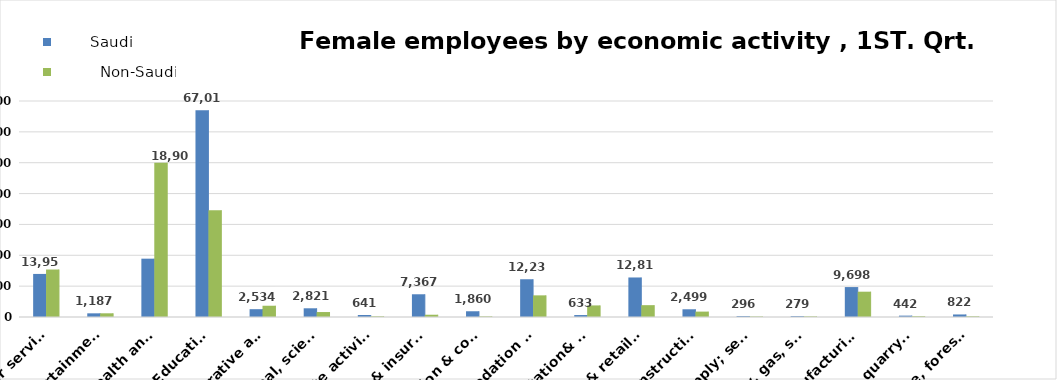
| Category |        Saudi      |          Non-Saudi        |
|---|---|---|
| Agriculture, forestry & fishing | 822 | 231 |
| Mining & quarrying | 442 | 256 |
| Manufacturing | 9698 | 8201 |
| Electricity, gas, steam & air conditioning supply | 279 | 199 |
| Water supply; sewerage, waste remediation  | 296 | 166 |
| Construction | 2499 | 1748 |
| Wholesale& retail trade; repair of motor vehicles | 12810 | 3836 |
| Transportation& storage | 633 | 3752 |
| Accommodation & food service activities | 12233 | 7012 |
| Information & communication | 1860 | 197 |
| Financial & insurance | 7367 | 734 |
| Real estate activities | 641 | 223 |
| Professional, scientific & technical activities | 2821 | 1608 |
| Administrative and support service activities | 2534 | 3648 |
| Education | 67013 | 34601 |
| Human health and &l work activities | 18904 | 50016 |
| Arts, entertainment & recreation | 1187 | 1198 |
| Other service | 13957 | 15389 |